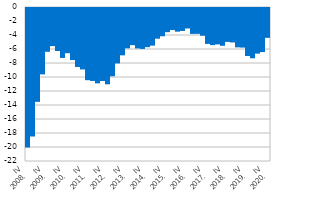
| Category | Биланс текућих трансакција (у % БДП-а) |
|---|---|
| IV
2008. | -19.941 |
| I | -18.368 |
| II | -13.408 |
| III | -9.485 |
| IV
2009. | -6.254 |
| I | -5.448 |
| II | -6.144 |
| III | -7.133 |
| IV
2010. | -6.459 |
| I | -7.436 |
| II | -8.428 |
| III | -8.779 |
| IV
2011. | -10.313 |
| I | -10.421 |
| II | -10.762 |
| III | -10.432 |
| IV
2012. | -10.901 |
| I | -9.751 |
| II | -7.918 |
| III | -6.762 |
| IV
2013. | -5.761 |
| I | -5.308 |
| II | -5.776 |
| III | -5.85 |
| IV
2014. | -5.596 |
| I | -5.376 |
| II | -4.387 |
| III | -4.038 |
| IV
2015. | -3.454 |
| I | -3.149 |
| II | -3.384 |
| III | -3.279 |
| IV
2016. | -2.927 |
| I | -3.702 |
| II | -3.696 |
| III | -3.964 |
| IV
2017. | -5.131 |
| I | -5.304 |
| II | -5.203 |
| III | -5.4 |
| IV
2018. | -4.844 |
| I | -4.923 |
| II | -5.626 |
| III | -5.657 |
| IV
2019. | -6.857 |
| I | -7.185 |
| II | -6.52 |
| III | -6.296 |
| IV
2020. | -4.264 |